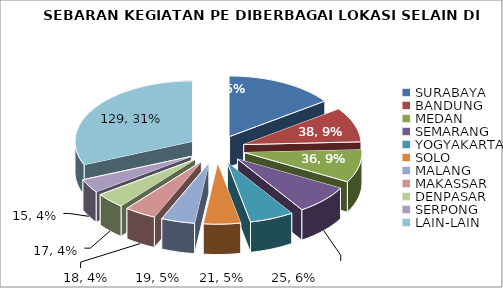
| Category | Series 0 |
|---|---|
| SURABAYA | 62 |
| BANDUNG | 38 |
| MEDAN | 36 |
| SEMARANG | 32 |
| YOGYAKARTA | 25 |
| SOLO | 21 |
| MALANG | 19 |
| MAKASSAR | 18 |
| DENPASAR | 17 |
| SERPONG | 15 |
| LAIN-LAIN | 129 |